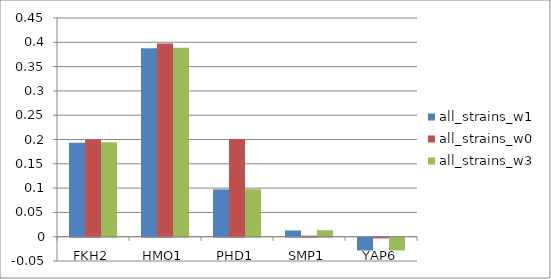
| Category | all_strains_w1 | all_strains_w0 | all_strains_w3 |
|---|---|---|---|
| FKH2 | 0.194 | 0.2 | 0.194 |
| HMO1 | 0.388 | 0.398 | 0.389 |
| PHD1 | 0.097 | 0.201 | 0.098 |
| SMP1 | 0.013 | 0.002 | 0.013 |
| YAP6 | -0.026 | -0.001 | -0.026 |